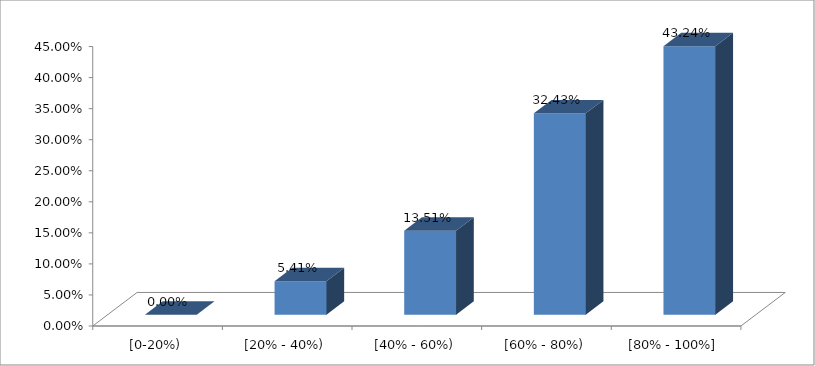
| Category | Series 0 |
|---|---|
| [0-20%) | 0 |
| [20% - 40%) | 0.054 |
| [40% - 60%) | 0.135 |
| [60% - 80%) | 0.324 |
| [80% - 100%] | 0.432 |